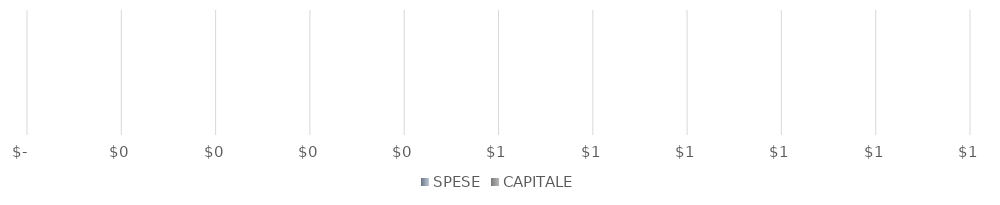
| Category | SPESE | CAPITALE |
|---|---|---|
| 0 | 0 | 0 |